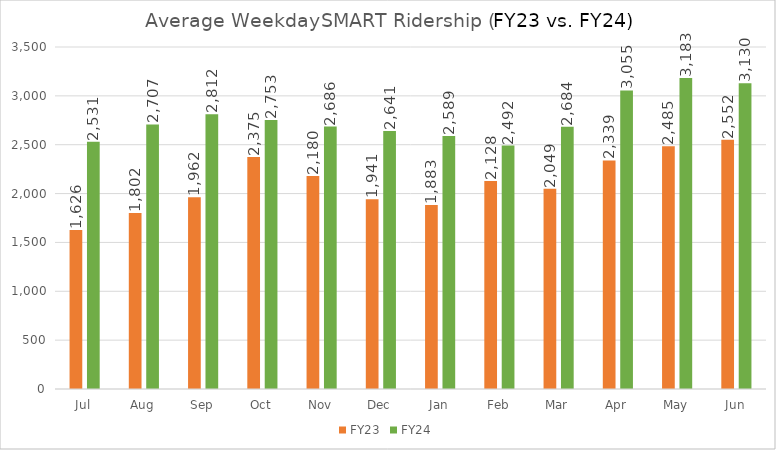
| Category | FY23 | FY24 |
|---|---|---|
| Jul | 1626 | 2531.45 |
| Aug | 1802 | 2707 |
| Sep | 1962 | 2812 |
| Oct | 2375 | 2753.409 |
| Nov | 2180 | 2686 |
| Dec | 1941 | 2641.4 |
| Jan | 1883 | 2589.227 |
| Feb | 2128 | 2491.571 |
| Mar | 2049 | 2684.333 |
| Apr | 2339 | 3054.864 |
| May | 2485 | 3183 |
| Jun | 2552 | 3130 |